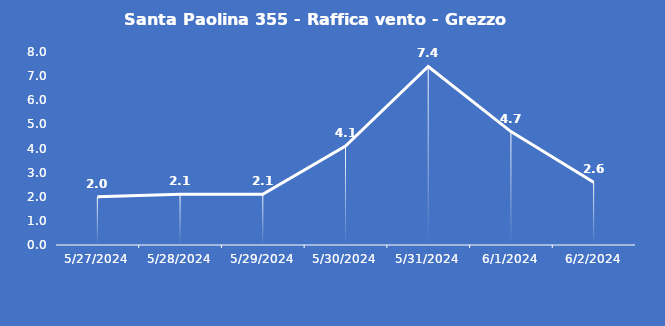
| Category | Santa Paolina 355 - Raffica vento - Grezzo (m/s) |
|---|---|
| 5/27/24 | 2 |
| 5/28/24 | 2.1 |
| 5/29/24 | 2.1 |
| 5/30/24 | 4.1 |
| 5/31/24 | 7.4 |
| 6/1/24 | 4.7 |
| 6/2/24 | 2.6 |